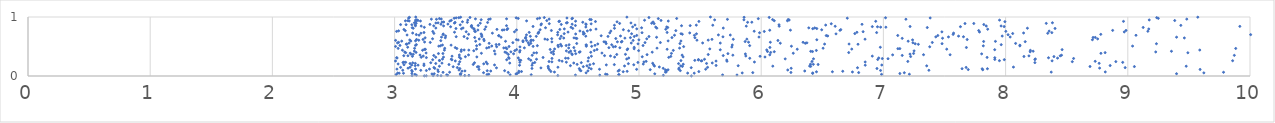
| Category | Series 0 |
|---|---|
| 5.428817333635568 | 0.001 |
| 3.2430600082995356 | 0.002 |
| 3.259115152229495 | 0.003 |
| 3.3800145465961697 | 0.004 |
| 3.142914970806867 | 0.005 |
| 3.3158163598350283 | 0.006 |
| 4.33579316453404 | 0.007 |
| 3.5742154195219453 | 0.008 |
| 3.3515652012079395 | 0.009 |
| 3.6079778392367365 | 0.01 |
| 5.199544906219686 | 0.011 |
| 3.4345632481465533 | 0.012 |
| 3.1782944018992687 | 0.013 |
| 4.678983305641667 | 0.014 |
| 4.480014773641924 | 0.015 |
| 3.5401760770701003 | 0.016 |
| 5.801911528291194 | 0.017 |
| 5.684050767464722 | 0.018 |
| 3.4262054713670143 | 0.019 |
| 3.9454600357421157 | 0.02 |
| 4.117840623836941 | 0.021 |
| 4.836502893186719 | 0.022 |
| 4.834765954356948 | 0.023 |
| 3.756604085655395 | 0.024 |
| 3.0131643142944973 | 0.025 |
| 4.738991136597106 | 0.026 |
| 3.166234503372161 | 0.027 |
| 6.984775032674837 | 0.028 |
| 3.77060841617881 | 0.029 |
| 7.212541355866186 | 0.03 |
| 4.726302508275617 | 0.031 |
| 11.897378637747282 | 0.032 |
| 3.5367762645915453 | 0.033 |
| 3.9931067859467717 | 0.034 |
| 3.3057862058746514 | 0.035 |
| 11.64043548956361 | 0.036 |
| 5.128986394491247 | 0.037 |
| 3.3241513599322037 | 0.038 |
| 9.39896405987348 | 0.039 |
| 3.542628311211485 | 0.04 |
| 4.001329980523215 | 0.041 |
| 7.134736684456321 | 0.042 |
| 12.122159313381347 | 0.043 |
| 3.141435175160536 | 0.044 |
| 6.420704587195409 | 0.045 |
| 3.072884722798536 | 0.046 |
| 3.037674314014352 | 0.047 |
| 5.451904931184801 | 0.048 |
| 5.398237659639951 | 0.049 |
| 3.02483720800493 | 0.05 |
| 6.4223215756821395 | 0.051 |
| 5.844686267448228 | 0.052 |
| 9.62243639667292 | 0.053 |
| 4.567194178815315 | 0.054 |
| 7.17127039289763 | 0.055 |
| 3.727858288689732 | 0.056 |
| 5.93100681174221 | 0.057 |
| 6.797615327625117 | 0.058 |
| 4.015617390483921 | 0.059 |
| 6.243276111481153 | 0.06 |
| 3.9299082523077935 | 0.061 |
| 3.3964834440837217 | 0.062 |
| 9.783564291856447 | 0.063 |
| 3.4502920379078765 | 0.064 |
| 5.216271794888181 | 0.065 |
| 8.373448291236752 | 0.066 |
| 4.3082090045365184 | 0.067 |
| 6.746564739497451 | 0.068 |
| 8.815811408056005 | 0.069 |
| 5.223246900188908 | 0.07 |
| 6.452362023729178 | 0.071 |
| 6.582636817385354 | 0.072 |
| 4.870665617162758 | 0.073 |
| 3.357517262542189 | 0.074 |
| 5.48974560710111 | 0.075 |
| 4.038355635317835 | 0.076 |
| 4.278954197748716 | 0.077 |
| 3.1445261074065005 | 0.078 |
| 4.903165954541031 | 0.079 |
| 6.667344507013722 | 0.08 |
| 4.01683450772153 | 0.081 |
| 3.5513729995820063 | 0.082 |
| 4.829140563284028 | 0.083 |
| 3.7868282480951674 | 0.084 |
| 6.356360023865067 | 0.085 |
| 3.5756584301844927 | 0.086 |
| 4.582356859733158 | 0.087 |
| 4.52459904130288 | 0.088 |
| 3.7578639193137366 | 0.089 |
| 3.9003261571554133 | 0.09 |
| 5.338014571486547 | 0.091 |
| 5.223127854643888 | 0.092 |
| 3.2599917088516444 | 0.093 |
| 6.9769496256486345 | 0.094 |
| 3.1401118006623396 | 0.095 |
| 3.2142186558007664 | 0.096 |
| 7.37231819238088 | 0.097 |
| 3.0665268626937263 | 0.098 |
| 4.838496615213479 | 0.099 |
| 4.5167111990015 | 0.1 |
| 3.527080594811234 | 0.101 |
| 6.217254932131739 | 0.102 |
| 3.353968277666904 | 0.103 |
| 5.216621596506478 | 0.104 |
| 5.237711314934598 | 0.105 |
| 7.812998696514635 | 0.106 |
| 5.0918546429739955 | 0.107 |
| 4.266480850364099 | 0.108 |
| 7.694147366536389 | 0.109 |
| 11.829199642393215 | 0.11 |
| 9.591753753393581 | 0.111 |
| 3.690775294030285 | 0.112 |
| 4.980577499459672 | 0.113 |
| 4.676764191816626 | 0.114 |
| 5.545589663530024 | 0.115 |
| 5.325979827903696 | 0.116 |
| 3.0190614931968276 | 0.117 |
| 3.2852294582236006 | 0.118 |
| 3.171226480126331 | 0.119 |
| 12.400732648684174 | 0.12 |
| 4.608908564966767 | 0.121 |
| 7.808153921922606 | 0.122 |
| 7.851115822563982 | 0.123 |
| 7.643764088786584 | 0.124 |
| 4.5113841114479705 | 0.125 |
| 3.5340311370523074 | 0.126 |
| 6.947320260022867 | 0.127 |
| 4.124177213728348 | 0.128 |
| 3.3288594087419825 | 0.129 |
| 5.19834318610899 | 0.13 |
| 6.245332206385374 | 0.131 |
| 5.326933408649213 | 0.132 |
| 3.1099787991862846 | 0.133 |
| 8.769359062722163 | 0.134 |
| 12.655323287305372 | 0.135 |
| 4.258022569550607 | 0.136 |
| 4.197442934210659 | 0.137 |
| 3.833684789369181 | 0.138 |
| 4.590336612323568 | 0.139 |
| 6.788264469514022 | 0.14 |
| 5.427350822300154 | 0.141 |
| 8.978511846359709 | 0.142 |
| 3.513337914935012 | 0.143 |
| 3.3217140946690495 | 0.144 |
| 7.6770057181140405 | 0.145 |
| 3.0490492321479437 | 0.146 |
| 5.561187054404862 | 0.147 |
| 3.1263451880711797 | 0.148 |
| 4.336619352306262 | 0.149 |
| 14.429964233804306 | 0.15 |
| 8.064145711107278 | 0.151 |
| 13.338708858645484 | 0.152 |
| 5.166510752078912 | 0.153 |
| 13.952106120475833 | 0.154 |
| 11.065517633634354 | 0.155 |
| 3.6774097065847977 | 0.156 |
| 3.479494802093697 | 0.157 |
| 3.688600624576538 | 0.158 |
| 4.544170278940204 | 0.159 |
| 9.053943468708749 | 0.16 |
| 8.690877156100047 | 0.161 |
| 5.355099091496674 | 0.162 |
| 6.405016550187433 | 0.163 |
| 4.256744379793641 | 0.164 |
| 3.366589701673759 | 0.165 |
| 9.477969239002901 | 0.166 |
| 6.094971006166667 | 0.167 |
| 6.396282473156539 | 0.168 |
| 5.126454856051331 | 0.169 |
| 4.881633032290846 | 0.17 |
| 5.341274649913306 | 0.171 |
| 7.354353158186277 | 0.172 |
| 4.574240745007161 | 0.173 |
| 5.811630011166736 | 0.174 |
| 4.43870938055641 | 0.175 |
| 3.168135719837944 | 0.176 |
| 8.85574092635082 | 0.177 |
| 3.2401517805483535 | 0.178 |
| 5.630915858959721 | 0.179 |
| 10.75005528078125 | 0.18 |
| 4.124736018390817 | 0.181 |
| 4.0226185122128495 | 0.182 |
| 6.851319419680584 | 0.183 |
| 3.1920926703301298 | 0.184 |
| 3.13963135024166 | 0.185 |
| 6.986849299973956 | 0.186 |
| 3.8178206487163973 | 0.187 |
| 4.732569168069002 | 0.188 |
| 5.119517193493204 | 0.189 |
| 4.957224251576168 | 0.19 |
| 3.077104284791254 | 0.191 |
| 4.598191712382566 | 0.192 |
| 4.798059575371258 | 0.193 |
| 3.4451159065184265 | 0.194 |
| 6.465895854050237 | 0.195 |
| 3.6434452230941563 | 0.196 |
| 4.493690487244242 | 0.197 |
| 6.426602975273266 | 0.198 |
| 5.362086157377647 | 0.199 |
| 6.403429595488954 | 0.2 |
| 3.5250021836226186 | 0.201 |
| 5.034872559095577 | 0.202 |
| 3.2402991113101662 | 0.203 |
| 3.0288296398441954 | 0.204 |
| 10.921966887937987 | 0.205 |
| 3.72918244210234 | 0.206 |
| 3.758929949255397 | 0.207 |
| 4.628128672334523 | 0.208 |
| 4.912960799062109 | 0.209 |
| 5.323821143135573 | 0.21 |
| 3.126209478054537 | 0.211 |
| 3.336722596788756 | 0.212 |
| 5.552883650549056 | 0.213 |
| 3.169512158469069 | 0.214 |
| 8.765672013004808 | 0.215 |
| 5.112038667323587 | 0.216 |
| 4.130131588647444 | 0.217 |
| 3.387703302356189 | 0.218 |
| 3.942529458857681 | 0.219 |
| 4.466080691765164 | 0.22 |
| 5.5995291489384815 | 0.221 |
| 12.819164975932692 | 0.222 |
| 3.148707621067979 | 0.223 |
| 3.6537945280319217 | 0.224 |
| 3.2960227536820996 | 0.225 |
| 4.527848399310504 | 0.226 |
| 8.239843323895988 | 0.227 |
| 3.0687344177114486 | 0.228 |
| 4.147094464172799 | 0.229 |
| 4.991086559751251 | 0.23 |
| 8.958395466594688 | 0.231 |
| 3.0904211152853653 | 0.232 |
| 4.025199251405678 | 0.233 |
| 4.405590812230501 | 0.234 |
| 3.075732771225312 | 0.235 |
| 3.74919714159178 | 0.236 |
| 5.944617090924352 | 0.237 |
| 6.850885014131551 | 0.238 |
| 5.040355524003521 | 0.239 |
| 4.287165475454836 | 0.24 |
| 14.261633288140297 | 0.241 |
| 3.5331271660999177 | 0.242 |
| 8.54592650742392 | 0.243 |
| 8.902084358564721 | 0.244 |
| 4.263763356954371 | 0.245 |
| 6.415825115767218 | 0.246 |
| 7.199884241200464 | 0.247 |
| 5.058641555657345 | 0.248 |
| 8.73323915001605 | 0.249 |
| 5.720346909113863 | 0.25 |
| 4.370683800250586 | 0.251 |
| 4.58279350977768 | 0.252 |
| 5.6305798531600075 | 0.253 |
| 3.007407145438922 | 0.254 |
| 3.4968933879101085 | 0.255 |
| 5.508724932857337 | 0.256 |
| 8.380489813356673 | 0.257 |
| 5.514289030040917 | 0.258 |
| 9.857895101496283 | 0.259 |
| 7.94959062775682 | 0.26 |
| 5.34327823246938 | 0.261 |
| 3.367383030359819 | 0.262 |
| 3.366921470596227 | 0.263 |
| 4.347021408194896 | 0.264 |
| 5.456633518273742 | 0.265 |
| 4.03235296162779 | 0.266 |
| 4.114376126715703 | 0.267 |
| 15.349247379445902 | 0.268 |
| 12.676249157981216 | 0.269 |
| 5.71776084931957 | 0.27 |
| 4.0211020978336744 | 0.271 |
| 5.486193044695446 | 0.272 |
| 11.418918470045925 | 0.273 |
| 3.469241255505863 | 0.274 |
| 3.917137130221853 | 0.275 |
| 3.3115986862754223 | 0.276 |
| 7.9894203529450225 | 0.277 |
| 5.4865948065723185 | 0.278 |
| 8.23937387487095 | 0.279 |
| 6.953444866312617 | 0.28 |
| 7.911833264354826 | 0.281 |
| 13.329588702853455 | 0.282 |
| 5.536198525555545 | 0.283 |
| 4.16137025964937 | 0.284 |
| 3.4638096154872287 | 0.285 |
| 12.102105600690269 | 0.286 |
| 3.3918742216705264 | 0.287 |
| 4.899223768723244 | 0.288 |
| 8.243399507610661 | 0.289 |
| 6.1964037136991035 | 0.29 |
| 6.427943859346431 | 0.291 |
| 4.096918430213073 | 0.292 |
| 7.037885816017816 | 0.293 |
| 14.571521659999764 | 0.294 |
| 6.990925805569228 | 0.295 |
| 3.5409681868780645 | 0.296 |
| 8.556492972940273 | 0.297 |
| 4.2879054835318 | 0.298 |
| 3.937125107132938 | 0.299 |
| 5.906357805956972 | 0.3 |
| 4.420279488422993 | 0.301 |
| 4.399078867585107 | 0.302 |
| 8.4251125332739 | 0.303 |
| 3.020006056696838 | 0.304 |
| 4.9162476620044515 | 0.305 |
| 6.961847032332614 | 0.306 |
| 4.011855786907852 | 0.307 |
| 4.587032863159367 | 0.308 |
| 8.351226667370089 | 0.309 |
| 7.911742421293299 | 0.31 |
| 3.0169573138619317 | 0.311 |
| 3.2600840857033924 | 0.312 |
| 3.932997617632132 | 0.313 |
| 4.215027994686972 | 0.314 |
| 7.848602391969418 | 0.315 |
| 5.24341366887886 | 0.316 |
| 3.217813120811254 | 0.317 |
| 3.336376198542261 | 0.318 |
| 3.5300307561208797 | 0.319 |
| 3.400012131556122 | 0.32 |
| 4.800456174362826 | 0.321 |
| 6.030933057674554 | 0.322 |
| 3.6730811263789214 | 0.323 |
| 5.360885682505778 | 0.324 |
| 11.030471886986813 | 0.325 |
| 5.026641903988354 | 0.326 |
| 3.5793110260670895 | 0.327 |
| 10.457661893191643 | 0.328 |
| 8.395544877680743 | 0.329 |
| 7.222910281306295 | 0.33 |
| 8.150126936005943 | 0.331 |
| 5.260299962833013 | 0.332 |
| 3.145868261725867 | 0.333 |
| 5.990816230348308 | 0.334 |
| 4.610333022162813 | 0.335 |
| 3.4701052059079047 | 0.336 |
| 6.909216527253211 | 0.337 |
| 3.234509695099943 | 0.338 |
| 5.874219548247286 | 0.339 |
| 4.766507492041103 | 0.34 |
| 8.191011881400257 | 0.341 |
| 8.446733396512881 | 0.342 |
| 3.108944956996453 | 0.343 |
| 3.0751296783897737 | 0.344 |
| 4.718075107285021 | 0.345 |
| 5.689245771382186 | 0.346 |
| 12.561421049615321 | 0.347 |
| 3.320590951430149 | 0.348 |
| 7.154134706981437 | 0.349 |
| 9.87181903280677 | 0.35 |
| 4.12583351487973 | 0.351 |
| 8.457661264312641 | 0.352 |
| 5.768085125449841 | 0.353 |
| 5.3528840274313385 | 0.354 |
| 3.208174334366499 | 0.355 |
| 3.5298635822983027 | 0.356 |
| 3.6050359517082162 | 0.357 |
| 7.075589476355683 | 0.358 |
| 6.070428570684585 | 0.359 |
| 7.5458748527880655 | 0.36 |
| 7.328491188694345 | 0.361 |
| 5.065998691545622 | 0.362 |
| 4.453767644082962 | 0.363 |
| 5.566519132788535 | 0.364 |
| 4.817912505000632 | 0.365 |
| 3.930613103109821 | 0.366 |
| 4.8891952069966225 | 0.367 |
| 10.193688437837565 | 0.368 |
| 3.153112017165451 | 0.369 |
| 3.1344336664320576 | 0.37 |
| 7.217937993472358 | 0.371 |
| 4.300773848664399 | 0.372 |
| 3.822685018563523 | 0.373 |
| 5.8704872944166855 | 0.374 |
| 7.804059567962019 | 0.375 |
| 3.973685710282057 | 0.376 |
| 4.449550160341576 | 0.377 |
| 4.48206129043721 | 0.378 |
| 5.727741837237457 | 0.379 |
| 3.3588578209788427 | 0.38 |
| 3.395281575067115 | 0.381 |
| 7.247088110822634 | 0.382 |
| 5.265558066071477 | 0.383 |
| 8.780139615603286 | 0.384 |
| 3.7102259486959603 | 0.385 |
| 6.262456071043781 | 0.386 |
| 3.1273915506445724 | 0.387 |
| 10.958233560406953 | 0.388 |
| 4.696773232819178 | 0.389 |
| 3.25790976951741 | 0.39 |
| 4.13982788812138 | 0.391 |
| 3.916164857729689 | 0.392 |
| 4.161828488753911 | 0.393 |
| 9.491561904463008 | 0.394 |
| 3.09095135777251 | 0.395 |
| 8.81444922100563 | 0.396 |
| 6.716275357364339 | 0.397 |
| 4.28208124944859 | 0.398 |
| 6.077602468458935 | 0.399 |
| 3.17566636926532 | 0.4 |
| 4.427259331238513 | 0.401 |
| 4.605340745455287 | 0.402 |
| 4.511581989785848 | 0.403 |
| 5.108150675190991 | 0.404 |
| 3.9030589072332385 | 0.405 |
| 3.082795253439055 | 0.406 |
| 4.023525480376419 | 0.407 |
| 9.228540330320158 | 0.408 |
| 3.951630787579831 | 0.409 |
| 4.518133407980914 | 0.41 |
| 8.201260834947384 | 0.411 |
| 6.107053760712631 | 0.412 |
| 13.568235057992627 | 0.413 |
| 6.4197837247914205 | 0.414 |
| 6.051779316054766 | 0.415 |
| 4.299781743292921 | 0.416 |
| 3.544344632375048 | 0.417 |
| 6.405228096398881 | 0.418 |
| 9.357216409883925 | 0.419 |
| 8.225460942092514 | 0.42 |
| 10.064315229750232 | 0.421 |
| 4.440233080044833 | 0.422 |
| 3.161918455719918 | 0.423 |
| 3.8165593483344726 | 0.424 |
| 4.40561167168303 | 0.425 |
| 7.251082672642775 | 0.426 |
| 4.47543457468284 | 0.427 |
| 3.64795226514581 | 0.428 |
| 3.983511097407469 | 0.429 |
| 4.996839103534285 | 0.43 |
| 4.026400149955991 | 0.431 |
| 4.634341775624602 | 0.432 |
| 6.451305535485453 | 0.433 |
| 5.2806920758715865 | 0.434 |
| 8.203048632593806 | 0.435 |
| 3.229049072604835 | 0.436 |
| 3.063919096682904 | 0.437 |
| 3.4076270880719126 | 0.438 |
| 3.607427681277076 | 0.439 |
| 9.589034880730145 | 0.44 |
| 3.569169704588043 | 0.441 |
| 6.045192837753699 | 0.442 |
| 3.546319158026363 | 0.443 |
| 5.665021673955655 | 0.444 |
| 4.903176767129639 | 0.445 |
| 7.910984186052942 | 0.446 |
| 8.462528633036548 | 0.447 |
| 3.9983859736201484 | 0.448 |
| 4.656343613554146 | 0.449 |
| 4.273132964029086 | 0.45 |
| 3.2444592304112656 | 0.451 |
| 3.252053601170068 | 0.452 |
| 5.2302704630376695 | 0.453 |
| 6.294922708047458 | 0.454 |
| 7.51829340328785 | 0.455 |
| 6.741213087983991 | 0.456 |
| 3.670441106830274 | 0.457 |
| 4.309246361267721 | 0.458 |
| 5.579445256002318 | 0.459 |
| 4.908007277358372 | 0.46 |
| 4.960365620057029 | 0.461 |
| 3.9185859982709896 | 0.462 |
| 7.118565870529059 | 0.463 |
| 7.1346437328718855 | 0.464 |
| 14.898919345739673 | 0.465 |
| 3.5096497090254335 | 0.466 |
| 9.883251786723525 | 0.467 |
| 3.028950330929217 | 0.468 |
| 3.1635701209735116 | 0.469 |
| 3.4100069211811928 | 0.47 |
| 6.506556284257026 | 0.471 |
| 5.1473219403331605 | 0.472 |
| 5.33212920473211 | 0.473 |
| 3.7534513565033905 | 0.474 |
| 4.424601310494112 | 0.475 |
| 3.8932089011728226 | 0.476 |
| 4.061983635853829 | 0.477 |
| 3.9110987544977847 | 0.478 |
| 4.843349316259678 | 0.479 |
| 4.753715060992541 | 0.48 |
| 3.496461688522759 | 0.481 |
| 4.466862381883753 | 0.482 |
| 7.679114636281012 | 0.483 |
| 6.071393553462619 | 0.484 |
| 3.7721659463212744 | 0.485 |
| 4.960742290683855 | 0.486 |
| 6.97491832618854 | 0.487 |
| 3.107139466945911 | 0.488 |
| 12.42161211614959 | 0.489 |
| 11.836627569136406 | 0.49 |
| 5.7597991279859615 | 0.491 |
| 10.259625026135968 | 0.492 |
| 4.025937058256174 | 0.493 |
| 4.790239456655009 | 0.494 |
| 7.379129141962164 | 0.495 |
| 3.8352122384846625 | 0.496 |
| 4.339985548618506 | 0.497 |
| 5.365385058765918 | 0.498 |
| 4.807272880402261 | 0.499 |
| 3.9366499174111826 | 0.5 |
| 3.007835679428499 | 0.501 |
| 4.133555031833379 | 0.502 |
| 4.612768160846997 | 0.503 |
| 4.5689960002409045 | 0.504 |
| 6.2472357867978605 | 0.505 |
| 3.361740394070263 | 0.506 |
| 9.039089975572837 | 0.507 |
| 3.7952390154228923 | 0.508 |
| 4.366108673083881 | 0.509 |
| 8.116860879538574 | 0.51 |
| 7.817607062069011 | 0.511 |
| 3.3757874737961795 | 0.512 |
| 3.671339981582945 | 0.513 |
| 4.168147316830132 | 0.514 |
| 5.905810461714147 | 0.515 |
| 5.033211432720927 | 0.516 |
| 4.403850242278002 | 0.517 |
| 3.0440135117510603 | 0.518 |
| 3.1711847132842257 | 0.519 |
| 4.639987685719796 | 0.52 |
| 4.337093330060994 | 0.521 |
| 8.117115922611065 | 0.522 |
| 3.4623247001641513 | 0.523 |
| 4.569234212403046 | 0.524 |
| 3.391538373609137 | 0.525 |
| 5.763202217387828 | 0.526 |
| 4.566802999969727 | 0.527 |
| 4.10032019437628 | 0.528 |
| 4.776592971290523 | 0.529 |
| 4.4279771689872405 | 0.53 |
| 7.964134226027079 | 0.531 |
| 3.1784389064613054 | 0.532 |
| 3.8310026843554743 | 0.533 |
| 3.697182659523986 | 0.534 |
| 3.855004908906656 | 0.535 |
| 4.357962466894113 | 0.536 |
| 7.286008481405674 | 0.537 |
| 6.792347594571438 | 0.538 |
| 3.0955193204371634 | 0.539 |
| 3.099822144571403 | 0.54 |
| 6.518743583040569 | 0.541 |
| 6.7190944944803865 | 0.542 |
| 4.662782299914387 | 0.543 |
| 10.440502149016199 | 0.544 |
| 4.992092652541259 | 0.545 |
| 7.260140965791088 | 0.546 |
| 9.234302980955757 | 0.547 |
| 7.480075793719706 | 0.548 |
| 4.731383579258239 | 0.549 |
| 5.3350471635310015 | 0.55 |
| 4.490218704647814 | 0.551 |
| 8.081857557205867 | 0.552 |
| 4.114758266625786 | 0.553 |
| 3.7736662491628934 | 0.554 |
| 6.36084867671037 | 0.555 |
| 6.156391614606198 | 0.556 |
| 3.1177965061374358 | 0.557 |
| 5.665144590713998 | 0.558 |
| 4.936583795225734 | 0.559 |
| 5.520731461967898 | 0.56 |
| 3.0237993991525207 | 0.561 |
| 6.374003337171905 | 0.562 |
| 7.241772747399537 | 0.563 |
| 4.093871576531499 | 0.564 |
| 3.967725929172611 | 0.565 |
| 5.049318328004585 | 0.566 |
| 5.174808033231585 | 0.567 |
| 7.4002960388259 | 0.568 |
| 3.291789469735891 | 0.569 |
| 3.032820043486444 | 0.57 |
| 6.342623446977004 | 0.571 |
| 6.074884656692026 | 0.572 |
| 5.896426578379534 | 0.573 |
| 4.607479328518196 | 0.574 |
| 4.727211309900136 | 0.575 |
| 3.2455129080606646 | 0.576 |
| 4.855419270798473 | 0.577 |
| 4.287115758487392 | 0.578 |
| 4.823374336730861 | 0.579 |
| 4.7134685769394045 | 0.58 |
| 4.050936221705893 | 0.581 |
| 8.160498541466577 | 0.582 |
| 13.728089186083313 | 0.583 |
| 5.868704239426288 | 0.584 |
| 7.82025736085079 | 0.585 |
| 4.860755182128254 | 0.586 |
| 7.916935691335628 | 0.587 |
| 3.907832294698344 | 0.588 |
| 3.6633449029189165 | 0.589 |
| 7.202688155216024 | 0.59 |
| 3.058262060398987 | 0.591 |
| 3.1328045246380514 | 0.592 |
| 5.343174061818653 | 0.593 |
| 4.113888909773051 | 0.594 |
| 5.238341209256166 | 0.595 |
| 3.1714377527783646 | 0.596 |
| 4.050769244233306 | 0.597 |
| 3.7326144459864468 | 0.598 |
| 3.3780432340427993 | 0.599 |
| 16.477421727916763 | 0.6 |
| 4.080194019041153 | 0.601 |
| 6.136981154972063 | 0.602 |
| 4.951938247982482 | 0.603 |
| 3.0079521265856455 | 0.604 |
| 4.134042598174004 | 0.605 |
| 3.19761366297939 | 0.606 |
| 5.474152780690195 | 0.607 |
| 5.566325198598195 | 0.608 |
| 4.117567181564237 | 0.609 |
| 4.011093043553533 | 0.61 |
| 3.1240803027291526 | 0.611 |
| 7.238725385267865 | 0.612 |
| 4.999049410936415 | 0.613 |
| 6.455184057679351 | 0.614 |
| 8.710372828865877 | 0.615 |
| 3.9968839218438355 | 0.616 |
| 4.250981210838275 | 0.617 |
| 7.685540859388257 | 0.618 |
| 3.179818265984235 | 0.619 |
| 3.2327070098480193 | 0.62 |
| 5.597279768994502 | 0.621 |
| 5.7714663472713035 | 0.622 |
| 3.7300490213564528 | 0.623 |
| 6.849816417446826 | 0.624 |
| 5.88271588732559 | 0.625 |
| 4.230144755671924 | 0.626 |
| 3.6926515382829663 | 0.627 |
| 12.566026673241849 | 0.628 |
| 8.753153820817257 | 0.629 |
| 5.063605562973091 | 0.63 |
| 3.310632504734641 | 0.631 |
| 14.634291571291127 | 0.632 |
| 4.285981033036704 | 0.633 |
| 4.353511204353101 | 0.634 |
| 4.810132903755919 | 0.635 |
| 4.491012822030115 | 0.636 |
| 3.5954675568138486 | 0.637 |
| 7.154049218041183 | 0.638 |
| 4.070946991643508 | 0.639 |
| 7.484103145650096 | 0.64 |
| 4.4839987081851795 | 0.641 |
| 4.8847284048469914 | 0.642 |
| 4.38421148849352 | 0.643 |
| 13.375150903002393 | 0.644 |
| 9.462838564931833 | 0.645 |
| 4.4679968672207 | 0.646 |
| 3.2498195901849756 | 0.647 |
| 3.4151160400815295 | 0.648 |
| 5.45766624148 | 0.649 |
| 4.929804676824436 | 0.65 |
| 5.269672277851003 | 0.651 |
| 3.655607645000344 | 0.652 |
| 8.716019397233527 | 0.653 |
| 8.733931671464795 | 0.654 |
| 4.073099035128913 | 0.655 |
| 5.143980488643145 | 0.656 |
| 3.871114876041743 | 0.657 |
| 9.399111300325668 | 0.658 |
| 3.3838138246614387 | 0.659 |
| 5.981901818863397 | 0.66 |
| 8.037361055961242 | 0.661 |
| 7.532514708103982 | 0.662 |
| 7.428758145349159 | 0.663 |
| 5.687074449987213 | 0.664 |
| 7.655181816328118 | 0.665 |
| 3.5039765542716164 | 0.666 |
| 3.7133110154606896 | 0.667 |
| 3.5684372257228167 | 0.668 |
| 5.08157780927484 | 0.669 |
| 4.961348571189207 | 0.67 |
| 4.746258650754506 | 0.671 |
| 4.159460088769748 | 0.672 |
| 4.110957801381917 | 0.673 |
| 4.363456440526208 | 0.674 |
| 4.564612221221127 | 0.675 |
| 7.614933724190064 | 0.676 |
| 7.972199644326908 | 0.677 |
| 4.848515875096843 | 0.678 |
| 6.544500650579884 | 0.679 |
| 3.4172846186693038 | 0.68 |
| 10.225795642011366 | 0.681 |
| 4.690394011317446 | 0.682 |
| 3.85148897326571 | 0.683 |
| 3.8532350480166175 | 0.684 |
| 6.532189282845966 | 0.685 |
| 7.445480700506913 | 0.686 |
| 7.117515425611981 | 0.687 |
| 4.981320227137639 | 0.688 |
| 5.453389732055467 | 0.689 |
| 9.067014277109362 | 0.69 |
| 5.290604797890204 | 0.691 |
| 3.2001970151688828 | 0.692 |
| 3.7134215605961827 | 0.693 |
| 5.747143351746993 | 0.694 |
| 3.1020410085200454 | 0.695 |
| 5.649831240655363 | 0.696 |
| 4.079212222013688 | 0.697 |
| 4.3340428348948485 | 0.698 |
| 10.709889836361654 | 0.699 |
| 8.020242851062815 | 0.7 |
| 10.005357889231266 | 0.701 |
| 3.177729909718783 | 0.702 |
| 3.3968342521147044 | 0.703 |
| 12.000212175975793 | 0.704 |
| 7.570664245193412 | 0.705 |
| 8.778943118117123 | 0.706 |
| 3.6058503732262244 | 0.707 |
| 5.354494814677886 | 0.708 |
| 4.545055337054057 | 0.709 |
| 13.340973925666692 | 0.71 |
| 3.3979463991753165 | 0.711 |
| 4.481615123775732 | 0.712 |
| 3.707913834898901 | 0.713 |
| 6.612235587861083 | 0.714 |
| 5.4701327115605025 | 0.715 |
| 4.9396054370895985 | 0.716 |
| 5.344038664177872 | 0.717 |
| 4.388060700485953 | 0.718 |
| 6.766217620210083 | 0.719 |
| 8.058002316258113 | 0.72 |
| 4.55221438435915 | 0.721 |
| 3.3216893994485086 | 0.722 |
| 4.173949843311498 | 0.723 |
| 8.344910738100179 | 0.724 |
| 3.2153619186945903 | 0.725 |
| 3.8003384302863554 | 0.726 |
| 7.574239125296847 | 0.727 |
| 3.1478545544449656 | 0.728 |
| 8.147299561673426 | 0.729 |
| 5.415211547018663 | 0.73 |
| 4.761095058662162 | 0.731 |
| 4.176390083046745 | 0.732 |
| 5.9866906175497725 | 0.733 |
| 5.0248753176242 | 0.734 |
| 8.378500950594995 | 0.735 |
| 6.944616724637283 | 0.736 |
| 3.2403937593539855 | 0.737 |
| 5.230263787886171 | 0.738 |
| 4.101524107248856 | 0.739 |
| 4.335345421784525 | 0.74 |
| 6.783326100868121 | 0.741 |
| 3.4903741905736223 | 0.742 |
| 4.179480697530856 | 0.743 |
| 4.419348523187832 | 0.744 |
| 4.543457779405374 | 0.745 |
| 7.786474076137635 | 0.746 |
| 8.971024312390075 | 0.747 |
| 7.4786526108588225 | 0.748 |
| 3.980959670542405 | 0.749 |
| 3.58590475979856 | 0.75 |
| 6.8339997730383555 | 0.751 |
| 15.087208059509715 | 0.752 |
| 3.661190888471711 | 0.753 |
| 3.312720300193187 | 0.754 |
| 6.025117645420423 | 0.755 |
| 3.016424667144558 | 0.756 |
| 8.001930493026903 | 0.757 |
| 9.164216001325876 | 0.758 |
| 5.942577299929084 | 0.759 |
| 3.655322141014991 | 0.76 |
| 8.356405600915274 | 0.761 |
| 4.769774198368513 | 0.762 |
| 4.5165610814996455 | 0.763 |
| 4.577383635295994 | 0.764 |
| 3.032934742373468 | 0.765 |
| 4.915634071398081 | 0.766 |
| 10.146866345861294 | 0.767 |
| 3.0875390275666255 | 0.768 |
| 5.30135904544813 | 0.769 |
| 7.779788134028002 | 0.77 |
| 4.282977425196682 | 0.771 |
| 8.985279736156688 | 0.772 |
| 8.876163327333817 | 0.773 |
| 6.644716009817383 | 0.774 |
| 10.703745944165739 | 0.775 |
| 6.069909033260144 | 0.776 |
| 6.239237641655065 | 0.777 |
| 3.8810808289081766 | 0.778 |
| 3.681630167632331 | 0.779 |
| 4.603520373497845 | 0.78 |
| 3.997189241495082 | 0.781 |
| 3.8957887710546517 | 0.782 |
| 6.495083019843863 | 0.783 |
| 4.1910180718199745 | 0.784 |
| 4.872139841963292 | 0.785 |
| 6.651166931677702 | 0.786 |
| 3.9198245139248025 | 0.787 |
| 3.0764021049089245 | 0.788 |
| 4.35218442549177 | 0.789 |
| 3.837608947297295 | 0.79 |
| 3.737816577239878 | 0.791 |
| 5.219219939961978 | 0.792 |
| 7.853537520132522 | 0.793 |
| 3.6516524046878196 | 0.794 |
| 4.64813155616204 | 0.795 |
| 10.125884681535455 | 0.796 |
| 9.171849973781153 | 0.797 |
| 4.3888976863377005 | 0.798 |
| 4.981589358632444 | 0.799 |
| 3.5469854857235443 | 0.8 |
| 3.647042651398484 | 0.801 |
| 6.421751760239134 | 0.802 |
| 3.925543802223725 | 0.803 |
| 6.454962831117509 | 0.804 |
| 3.5021912236097665 | 0.805 |
| 8.40468114691284 | 0.806 |
| 4.4576574389594725 | 0.807 |
| 4.799042463987889 | 0.808 |
| 3.1522307499493363 | 0.809 |
| 8.178482199496926 | 0.81 |
| 5.146311720638668 | 0.811 |
| 5.689729835436237 | 0.812 |
| 3.3375405643418485 | 0.813 |
| 3.5602974819533895 | 0.814 |
| 6.438078636924239 | 0.815 |
| 6.389324395155068 | 0.816 |
| 5.021306498231053 | 0.817 |
| 4.235170792952474 | 0.818 |
| 3.144253256303724 | 0.819 |
| 10.758654545320976 | 0.82 |
| 7.359069315805419 | 0.821 |
| 5.2350431081155815 | 0.822 |
| 9.12586516551378 | 0.823 |
| 3.6332264051566026 | 0.824 |
| 3.2432301819906075 | 0.825 |
| 4.443719061146851 | 0.826 |
| 7.020319535613011 | 0.827 |
| 6.977395154412477 | 0.828 |
| 5.136660681257468 | 0.829 |
| 4.5650299317372065 | 0.83 |
| 5.226933407764165 | 0.831 |
| 4.947865734696602 | 0.832 |
| 3.747239318504104 | 0.833 |
| 6.951563154804146 | 0.834 |
| 3.4585025865193026 | 0.835 |
| 7.630526864516609 | 0.836 |
| 6.909303197321816 | 0.837 |
| 7.988107212768303 | 0.838 |
| 7.21838656913191 | 0.839 |
| 4.132989298214903 | 0.84 |
| 9.91687090462549 | 0.841 |
| 3.627782486336699 | 0.842 |
| 6.60536503605012 | 0.843 |
| 6.147080833797514 | 0.844 |
| 5.877878932861476 | 0.845 |
| 3.21765649929857 | 0.846 |
| 7.841986037510739 | 0.847 |
| 7.963097363186993 | 0.848 |
| 3.4008402157718667 | 0.849 |
| 3.3202375330132123 | 0.85 |
| 3.170709300204177 | 0.851 |
| 5.348161729685497 | 0.852 |
| 3.915856742371548 | 0.853 |
| 5.419002961407665 | 0.854 |
| 3.630033426513492 | 0.855 |
| 4.479547805027757 | 0.856 |
| 3.6842916535797805 | 0.857 |
| 9.433960704006552 | 0.858 |
| 10.011196127849676 | 0.859 |
| 4.798903947298663 | 0.86 |
| 5.603824104399111 | 0.861 |
| 5.469002223265349 | 0.862 |
| 6.527742954208312 | 0.863 |
| 4.967350910705971 | 0.864 |
| 3.1686724566749502 | 0.865 |
| 4.197570884969475 | 0.866 |
| 3.5368605365560226 | 0.867 |
| 6.145921742835471 | 0.868 |
| 3.1411434296183103 | 0.869 |
| 3.093980257860288 | 0.87 |
| 3.048995570148998 | 0.871 |
| 7.82195888001266 | 0.872 |
| 4.567363043213005 | 0.873 |
| 4.364010730651241 | 0.874 |
| 3.289071672371949 | 0.875 |
| 6.825040490968503 | 0.876 |
| 3.3794157365157065 | 0.877 |
| 4.453027574718766 | 0.878 |
| 15.903093031785444 | 0.879 |
| 3.4364049657090225 | 0.88 |
| 22.085284134361366 | 0.881 |
| 4.565072380490069 | 0.882 |
| 4.201478220471848 | 0.883 |
| 4.608405747920353 | 0.884 |
| 6.573434442296484 | 0.885 |
| 13.607431042505716 | 0.886 |
| 4.265932652051135 | 0.887 |
| 5.123795480255884 | 0.888 |
| 7.6676717700542305 | 0.889 |
| 7.739883354798787 | 0.89 |
| 4.841511483966558 | 0.891 |
| 8.332854792558832 | 0.892 |
| 3.1762839740668993 | 0.893 |
| 5.103542141523648 | 0.894 |
| 3.701054272791432 | 0.895 |
| 3.489928905345738 | 0.896 |
| 11.183687249302514 | 0.897 |
| 3.337714741422268 | 0.898 |
| 4.934217550850556 | 0.899 |
| 4.40614136830802 | 0.9 |
| 3.355591517479799 | 0.901 |
| 8.383139562294712 | 0.902 |
| 3.162042399402584 | 0.903 |
| 4.413297949615149 | 0.904 |
| 13.377282316326705 | 0.905 |
| 10.073077179167054 | 0.906 |
| 3.761239587877896 | 0.907 |
| 3.4951119558007173 | 0.908 |
| 3.595495362722467 | 0.909 |
| 5.888754297169312 | 0.91 |
| 4.539866832613429 | 0.911 |
| 5.9233510928916004 | 0.912 |
| 3.3879691399549112 | 0.913 |
| 13.057027373077638 | 0.914 |
| 3.4019488304213117 | 0.915 |
| 5.115115110220229 | 0.916 |
| 3.1734932051450415 | 0.917 |
| 4.820286722088638 | 0.918 |
| 11.237237948015391 | 0.919 |
| 3.555038191967453 | 0.92 |
| 7.994362812493529 | 0.921 |
| 16.200359837501697 | 0.922 |
| 4.643714715487534 | 0.923 |
| 4.344353064583009 | 0.924 |
| 5.4902955612545075 | 0.925 |
| 8.964756403607536 | 0.926 |
| 6.937228831006395 | 0.927 |
| 4.349243860315429 | 0.928 |
| 4.481154809387412 | 0.929 |
| 3.4513585458327776 | 0.93 |
| 5.2396835975960805 | 0.931 |
| 3.211383748674194 | 0.932 |
| 3.1195000546342038 | 0.933 |
| 4.0801056871113754 | 0.934 |
| 3.0885833887850964 | 0.935 |
| 6.214919061134503 | 0.936 |
| 6.106937284302207 | 0.937 |
| 3.10866665781006 | 0.938 |
| 4.245592228186219 | 0.939 |
| 9.38398894109725 | 0.94 |
| 3.190766318528941 | 0.941 |
| 5.180191690189082 | 0.942 |
| 11.99197104949526 | 0.943 |
| 3.4641160663582666 | 0.944 |
| 5.045636252090599 | 0.945 |
| 3.1712429212365607 | 0.946 |
| 7.950426276178899 | 0.947 |
| 3.598967416215344 | 0.948 |
| 6.229000231633295 | 0.949 |
| 9.175491261640424 | 0.95 |
| 5.619009178367486 | 0.951 |
| 5.858532891171276 | 0.952 |
| 3.1822102637689196 | 0.953 |
| 3.7085159523780784 | 0.954 |
| 4.609069837084407 | 0.955 |
| 6.093305243621966 | 0.956 |
| 6.220613175772042 | 0.957 |
| 4.597440611579803 | 0.958 |
| 3.7692013323877394 | 0.959 |
| 5.723798585983646 | 0.96 |
| 3.3424193950827346 | 0.961 |
| 7.184265641150582 | 0.962 |
| 3.3010142984737243 | 0.963 |
| 9.482643706163675 | 0.964 |
| 4.264797529070351 | 0.965 |
| 3.382055058472762 | 0.966 |
| 3.782903924392896 | 0.967 |
| 3.661702467734882 | 0.968 |
| 3.9163015653840056 | 0.969 |
| 4.450952485168991 | 0.97 |
| 4.168487060493979 | 0.971 |
| 5.97625671783152 | 0.972 |
| 5.158064797765167 | 0.973 |
| 3.3665400239852286 | 0.974 |
| 5.308197360549502 | 0.975 |
| 4.011629315600969 | 0.976 |
| 9.249552768020152 | 0.977 |
| 4.455639309621052 | 0.978 |
| 3.4874590591741415 | 0.979 |
| 6.704625602348688 | 0.98 |
| 4.186829073300181 | 0.981 |
| 3.1146218326305037 | 0.982 |
| 4.410372478965249 | 0.983 |
| 7.382799282785332 | 0.984 |
| 3.5037779678435825 | 0.985 |
| 3.99465038701696 | 0.986 |
| 7.017783903502952 | 0.987 |
| 3.5251902342185866 | 0.988 |
| 9.23675480153038 | 0.989 |
| 4.224775564773874 | 0.99 |
| 5.08134375287448 | 0.991 |
| 3.6168601461060517 | 0.992 |
| 6.065610978352655 | 0.993 |
| 3.121466034719292 | 0.994 |
| 5.860096417216315 | 0.995 |
| 3.540379331109337 | 0.996 |
| 9.572920339356457 | 0.997 |
| 4.901120228671006 | 0.998 |
| 3.173101490802396 | 0.999 |
| 5.584577860240229 | 1 |